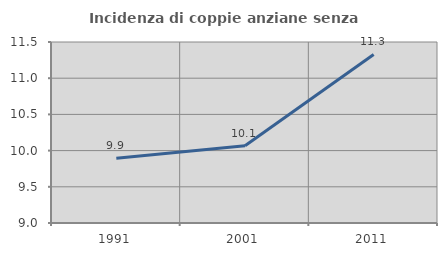
| Category | Incidenza di coppie anziane senza figli  |
|---|---|
| 1991.0 | 9.893 |
| 2001.0 | 10.066 |
| 2011.0 | 11.328 |